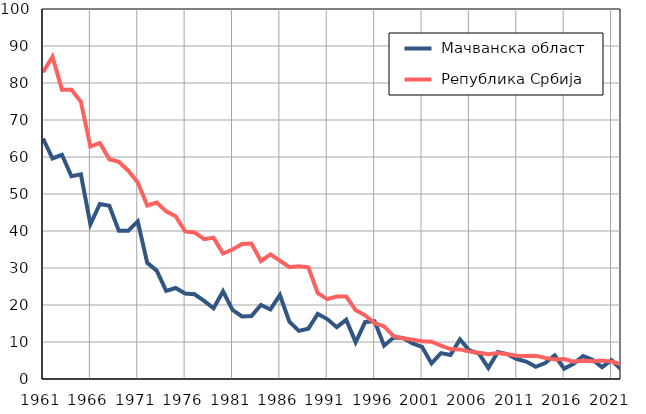
| Category |  Мачванска област |  Република Србија |
|---|---|---|
| 1961.0 | 65 | 82.9 |
| 1962.0 | 59.6 | 87.1 |
| 1963.0 | 60.6 | 78.2 |
| 1964.0 | 54.8 | 78.2 |
| 1965.0 | 55.3 | 74.9 |
| 1966.0 | 41.8 | 62.8 |
| 1967.0 | 47.3 | 63.8 |
| 1968.0 | 46.8 | 59.4 |
| 1969.0 | 40.1 | 58.7 |
| 1970.0 | 40.1 | 56.3 |
| 1971.0 | 42.6 | 53.1 |
| 1972.0 | 31.4 | 46.9 |
| 1973.0 | 29.3 | 47.7 |
| 1974.0 | 23.8 | 45.3 |
| 1975.0 | 24.6 | 44 |
| 1976.0 | 23.1 | 39.9 |
| 1977.0 | 22.9 | 39.6 |
| 1978.0 | 21.1 | 37.8 |
| 1979.0 | 19.1 | 38.2 |
| 1980.0 | 23.7 | 33.9 |
| 1981.0 | 18.7 | 35 |
| 1982.0 | 16.9 | 36.5 |
| 1983.0 | 17 | 36.6 |
| 1984.0 | 20 | 31.9 |
| 1985.0 | 18.8 | 33.7 |
| 1986.0 | 22.7 | 32 |
| 1987.0 | 15.5 | 30.2 |
| 1988.0 | 13 | 30.5 |
| 1989.0 | 13.6 | 30.2 |
| 1990.0 | 17.6 | 23.2 |
| 1991.0 | 16.2 | 21.6 |
| 1992.0 | 14 | 22.3 |
| 1993.0 | 16 | 22.3 |
| 1994.0 | 9.9 | 18.6 |
| 1995.0 | 15.4 | 17.2 |
| 1996.0 | 15.6 | 15.1 |
| 1997.0 | 9 | 14.2 |
| 1998.0 | 11.2 | 11.6 |
| 1999.0 | 11.1 | 11 |
| 2000.0 | 9.6 | 10.6 |
| 2001.0 | 8.7 | 10.2 |
| 2002.0 | 4.2 | 10.1 |
| 2003.0 | 7 | 9 |
| 2004.0 | 6.5 | 8.1 |
| 2005.0 | 10.7 | 8 |
| 2006.0 | 7.7 | 7.4 |
| 2007.0 | 6.9 | 7.1 |
| 2008.0 | 3 | 6.7 |
| 2009.0 | 7.3 | 7 |
| 2010.0 | 6.7 | 6.7 |
| 2011.0 | 5.4 | 6.3 |
| 2012.0 | 4.7 | 6.2 |
| 2013.0 | 3.3 | 6.3 |
| 2014.0 | 4.3 | 5.7 |
| 2015.0 | 6.4 | 5.3 |
| 2016.0 | 2.8 | 5.4 |
| 2017.0 | 4.1 | 4.7 |
| 2018.0 | 6.2 | 4.9 |
| 2019.0 | 5.2 | 4.8 |
| 2020.0 | 3.2 | 5 |
| 2021.0 | 5.1 | 4.7 |
| 2022.0 | 2.6 | 4 |